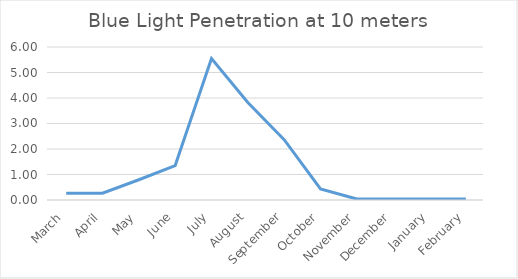
| Category | Light at 10m Below Ice |
|---|---|
| March | 0.262 |
| April | 0.266 |
| May | 0.795 |
| June | 1.35 |
| July | 5.546 |
| August | 3.824 |
| September | 2.365 |
| October | 0.433 |
| November | 0.037 |
| December | 0.036 |
| January | 0.037 |
| February | 0.038 |